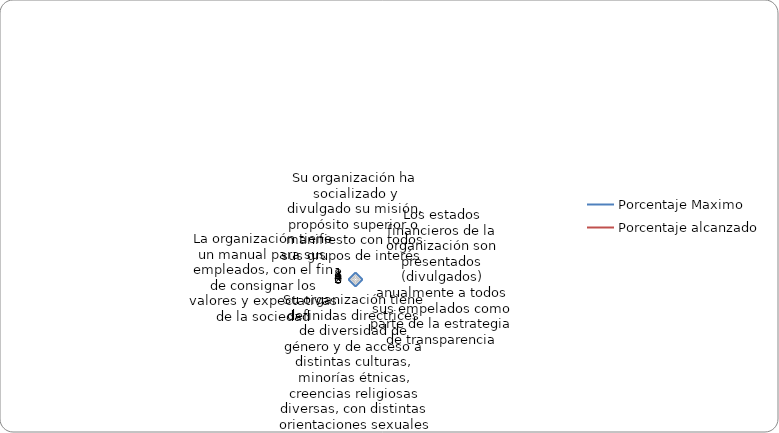
| Category | Porcentaje Maximo | Porcentaje alcanzado |
|---|---|---|
| Su organización ha socializado y divulgado su misión, propósito superior o manifiesto con todos sus grupos de interés  | 1 | 0 |
| Los estados financieros de la organización son presentados (divulgados) anualmente a todos sus empelados como parte de la estrategia de transparencia | 1 | 0 |
| Su organización tiene definidas directrices de diversidad de género y de acceso a distintas culturas, minorías étnicas, creencias religiosas diversas, con distintas orientaciones sexuales y capacidades físicas heterogéneas, para ocupar cargos directivos, j | 1 | 0 |
| La organización tiene un manual para sus empleados, con el fin de consignar los valores y expectativas de la sociedad | 1 | 0 |